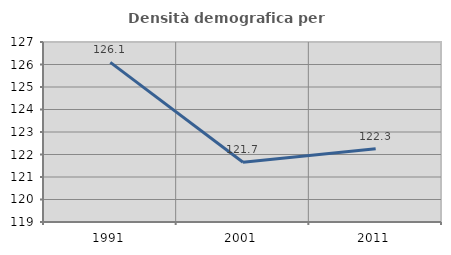
| Category | Densità demografica |
|---|---|
| 1991.0 | 126.092 |
| 2001.0 | 121.657 |
| 2011.0 | 122.257 |